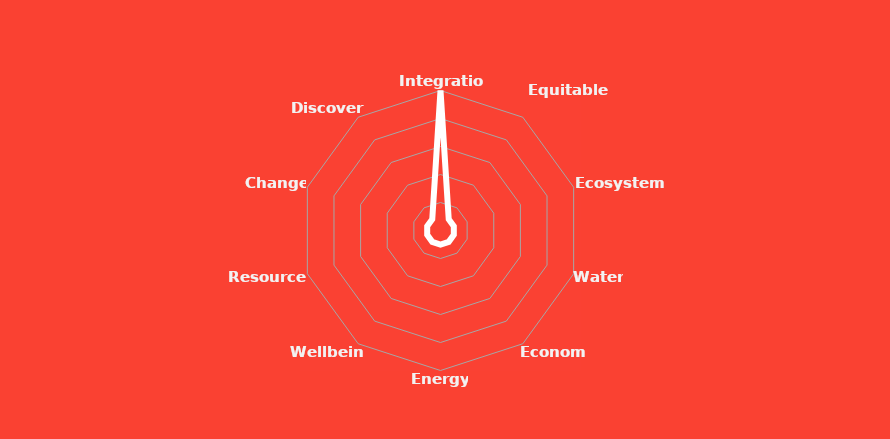
| Category | Series 0 |
|---|---|
| Integration | 10 |
| Equitable
 Communities  | 1 |
| Ecosystems | 1 |
| Water | 1 |
| Economy | 1 |
| Energy | 1 |
| Wellbeing | 1 |
| Resources | 1 |
| Change | 1 |
| Discovery | 1 |